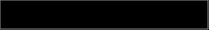
| Category | Series 0 |
|---|---|
| 0 | 0.165 |
| 1 | 0.823 |
| 2 | 0.012 |